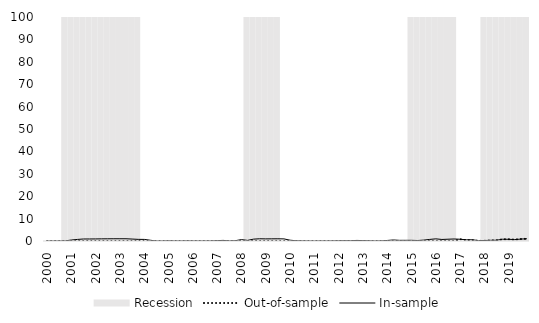
| Category | Recession |
|---|---|
| 2000.0 | 0 |
| 2000.0 | 0 |
| 2000.0 | 0 |
| 2000.0 | 1 |
| 2001.0 | 1 |
| 2001.0 | 1 |
| 2001.0 | 1 |
| 2001.0 | 1 |
| 2002.0 | 1 |
| 2002.0 | 1 |
| 2002.0 | 1 |
| 2002.0 | 1 |
| 2003.0 | 1 |
| 2003.0 | 1 |
| 2003.0 | 1 |
| 2003.0 | 1 |
| 2004.0 | 0 |
| 2004.0 | 0 |
| 2004.0 | 0 |
| 2004.0 | 0 |
| 2005.0 | 0 |
| 2005.0 | 0 |
| 2005.0 | 0 |
| 2005.0 | 0 |
| 2006.0 | 0 |
| 2006.0 | 0 |
| 2006.0 | 0 |
| 2006.0 | 0 |
| 2007.0 | 0 |
| 2007.0 | 0 |
| 2007.0 | 0 |
| 2007.0 | 0 |
| 2008.0 | 0 |
| 2008.0 | 1 |
| 2008.0 | 1 |
| 2008.0 | 1 |
| 2009.0 | 1 |
| 2009.0 | 1 |
| 2009.0 | 1 |
| 2009.0 | 0 |
| 2010.0 | 0 |
| 2010.0 | 0 |
| 2010.0 | 0 |
| 2010.0 | 0 |
| 2011.0 | 0 |
| 2011.0 | 0 |
| 2011.0 | 0 |
| 2011.0 | 0 |
| 2012.0 | 0 |
| 2012.0 | 0 |
| 2012.0 | 0 |
| 2012.0 | 0 |
| 2013.0 | 0 |
| 2013.0 | 0 |
| 2013.0 | 0 |
| 2013.0 | 0 |
| 2014.0 | 0 |
| 2014.0 | 0 |
| 2014.0 | 0 |
| 2014.0 | 0 |
| 2015.0 | 1 |
| 2015.0 | 1 |
| 2015.0 | 1 |
| 2015.0 | 1 |
| 2016.0 | 1 |
| 2016.0 | 1 |
| 2016.0 | 1 |
| 2016.0 | 1 |
| 2017.0 | 0 |
| 2017.0 | 0 |
| 2017.0 | 0 |
| 2017.0 | 0 |
| 2018.0 | 1 |
| 2018.0 | 1 |
| 2018.0 | 1 |
| 2018.0 | 1 |
| 2019.0 | 1 |
| 2019.0 | 1 |
| 2019.0 | 1 |
| 2019.0 | 1 |